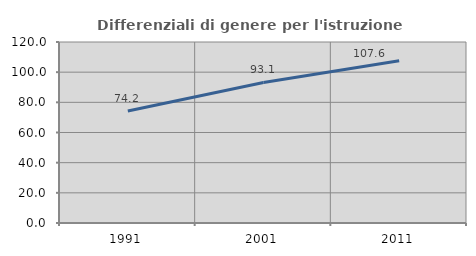
| Category | Differenziali di genere per l'istruzione superiore |
|---|---|
| 1991.0 | 74.239 |
| 2001.0 | 93.15 |
| 2011.0 | 107.568 |